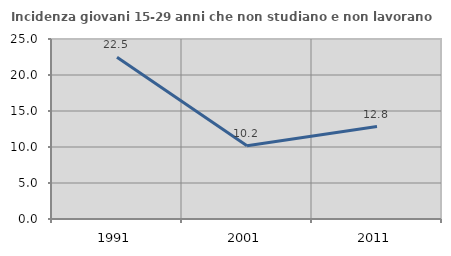
| Category | Incidenza giovani 15-29 anni che non studiano e non lavorano  |
|---|---|
| 1991.0 | 22.456 |
| 2001.0 | 10.169 |
| 2011.0 | 12.844 |